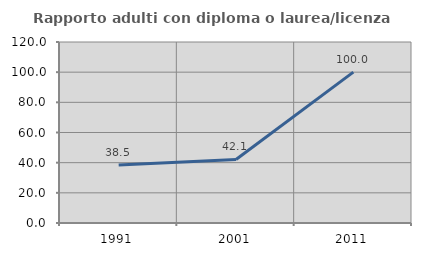
| Category | Rapporto adulti con diploma o laurea/licenza media  |
|---|---|
| 1991.0 | 38.462 |
| 2001.0 | 42.105 |
| 2011.0 | 100 |